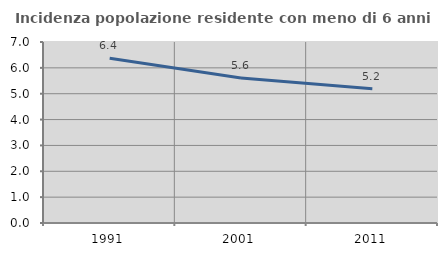
| Category | Incidenza popolazione residente con meno di 6 anni |
|---|---|
| 1991.0 | 6.375 |
| 2001.0 | 5.608 |
| 2011.0 | 5.196 |